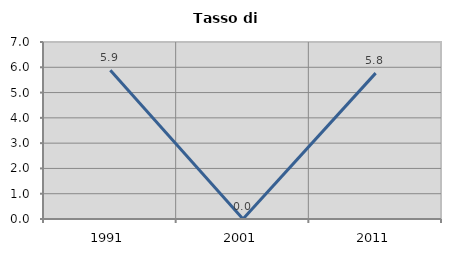
| Category | Tasso di disoccupazione   |
|---|---|
| 1991.0 | 5.882 |
| 2001.0 | 0 |
| 2011.0 | 5.769 |